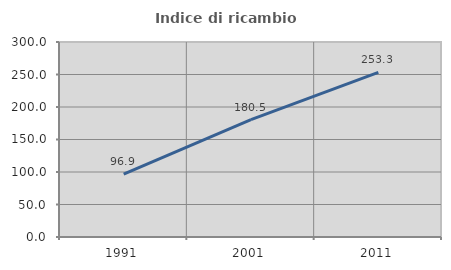
| Category | Indice di ricambio occupazionale  |
|---|---|
| 1991.0 | 96.875 |
| 2001.0 | 180.488 |
| 2011.0 | 253.333 |